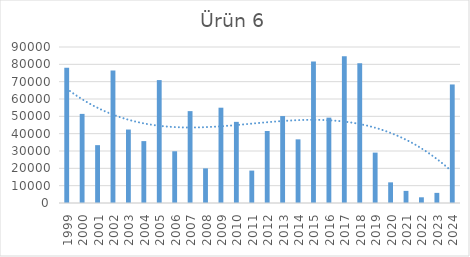
| Category | Ürün 6 |
|---|---|
| 1999.0 | 77971 |
| 2000.0 | 51408 |
| 2001.0 | 33377 |
| 2002.0 | 76380 |
| 2003.0 | 42389 |
| 2004.0 | 35706 |
| 2005.0 | 70912 |
| 2006.0 | 29848 |
| 2007.0 | 53011 |
| 2008.0 | 19982 |
| 2009.0 | 54981 |
| 2010.0 | 46811 |
| 2011.0 | 18699 |
| 2012.0 | 41532 |
| 2013.0 | 50156 |
| 2014.0 | 36718 |
| 2015.0 | 81704 |
| 2016.0 | 49243 |
| 2017.0 | 84665 |
| 2018.0 | 80586 |
| 2019.0 | 29062 |
| 2020.0 | 11913 |
| 2021.0 | 6992 |
| 2022.0 | 3291 |
| 2023.0 | 5840 |
| 2024.0 | 68390 |